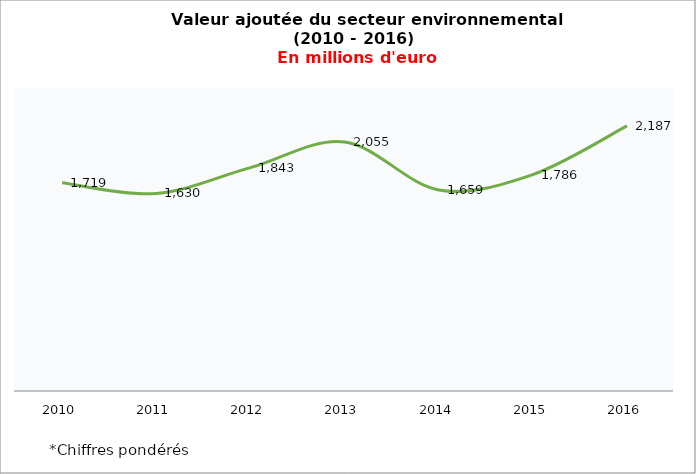
| Category | Valeur ajoutée |
|---|---|
| 2010 | 1719.115 |
| 2011 | 1629.545 |
| 2012 | 1842.594 |
| 2013 | 2054.694 |
| 2014 | 1659.168 |
| 2015 | 1785.788 |
| 2016 | 2187.007 |